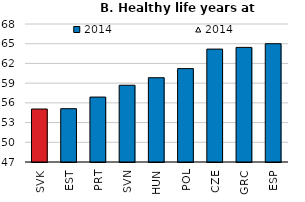
| Category | 2014 |
|---|---|
| SVK | 55.061 |
| EST | 55.112 |
| PRT | 56.88 |
| SVN | 58.678 |
| HUN | 59.824 |
| POL | 61.211 |
| CZE | 64.18 |
| GRC | 64.44 |
| ESP | 65 |